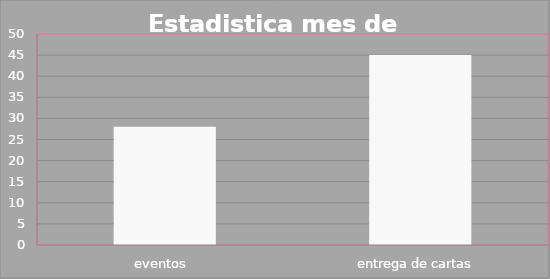
| Category | Series 0 |
|---|---|
| eventos  | 28 |
| entrega de cartas  | 45 |